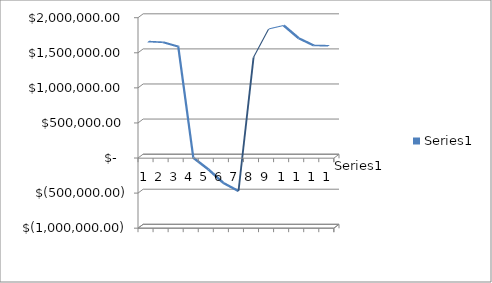
| Category | Series 0 |
|---|---|
| 0 | 1616831.23 |
| 1 | 1606767.35 |
| 2 | 1545902.33 |
| 3 | -39331.92 |
| 4 | -205186.52 |
| 5 | -398700.03 |
| 6 | -514664.79 |
| 7 | 1393268.42 |
| 8 | 1796670.11 |
| 9 | 1846498.52 |
| 10 | 1663943 |
| 11 | 1560943 |
| 12 | 1557619 |